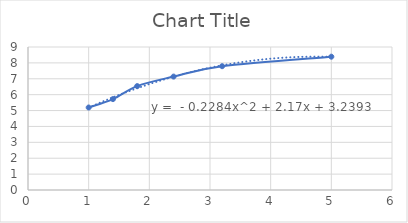
| Category | Series 0 |
|---|---|
| 1.0 | 5.192 |
| 1.4 | 5.72 |
| 1.8 | 6.539 |
| 2.4 | 7.138 |
| 3.2 | 7.792 |
| 5.0 | 8.39 |